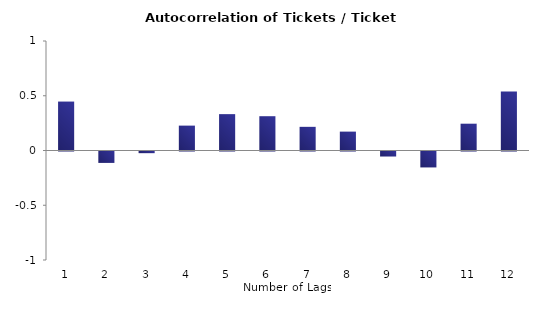
| Category | Series 0 |
|---|---|
| 0 | 0.447 |
| 1 | -0.104 |
| 2 | -0.015 |
| 3 | 0.227 |
| 4 | 0.332 |
| 5 | 0.313 |
| 6 | 0.216 |
| 7 | 0.173 |
| 8 | -0.046 |
| 9 | -0.146 |
| 10 | 0.245 |
| 11 | 0.54 |